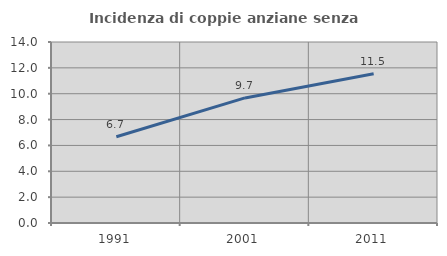
| Category | Incidenza di coppie anziane senza figli  |
|---|---|
| 1991.0 | 6.676 |
| 2001.0 | 9.675 |
| 2011.0 | 11.543 |